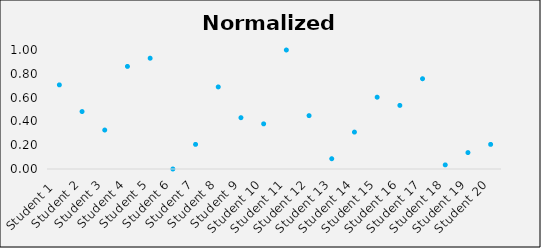
| Category | Normalized score |
|---|---|
| Student 1  | 0.707 |
| Student 2 | 0.483 |
| Student 3 | 0.328 |
| Student 4 | 0.862 |
| Student 5 | 0.931 |
| Student 6 | 0 |
| Student 7 | 0.207 |
| Student 8 | 0.69 |
| Student 9 | 0.431 |
| Student 10 | 0.379 |
| Student 11 | 1 |
| Student 12 | 0.448 |
| Student 13 | 0.086 |
| Student 14 | 0.31 |
| Student 15 | 0.603 |
| Student 16 | 0.534 |
| Student 17 | 0.759 |
| Student 18 | 0.034 |
| Student 19 | 0.138 |
| Student 20 | 0.207 |